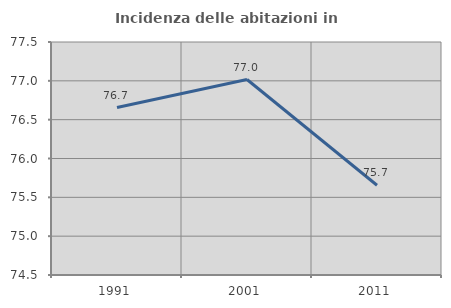
| Category | Incidenza delle abitazioni in proprietà  |
|---|---|
| 1991.0 | 76.656 |
| 2001.0 | 77.017 |
| 2011.0 | 75.655 |